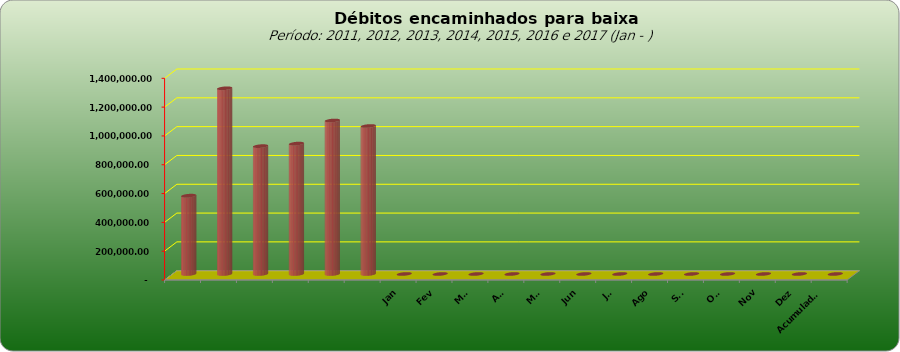
| Category |  543.796,20  |
|---|---|
|  | 543796.2 |
|  | 1289053.69 |
|  | 887573.08 |
|  | 905052.31 |
|  | 1065434.28 |
|  | 1027209.41 |
| Jan | 0 |
| Fev | 0 |
| Mar | 0 |
| Abr | 0 |
| Mai | 0 |
| Jun | 0 |
| Jul | 0 |
| Ago | 0 |
| Set | 0 |
| Out | 0 |
| Nov | 0 |
| Dez | 0 |
| Acumulado
2016 | 0 |